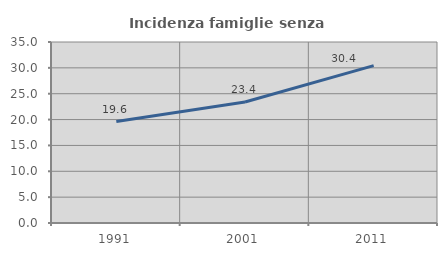
| Category | Incidenza famiglie senza nuclei |
|---|---|
| 1991.0 | 19.619 |
| 2001.0 | 23.386 |
| 2011.0 | 30.431 |